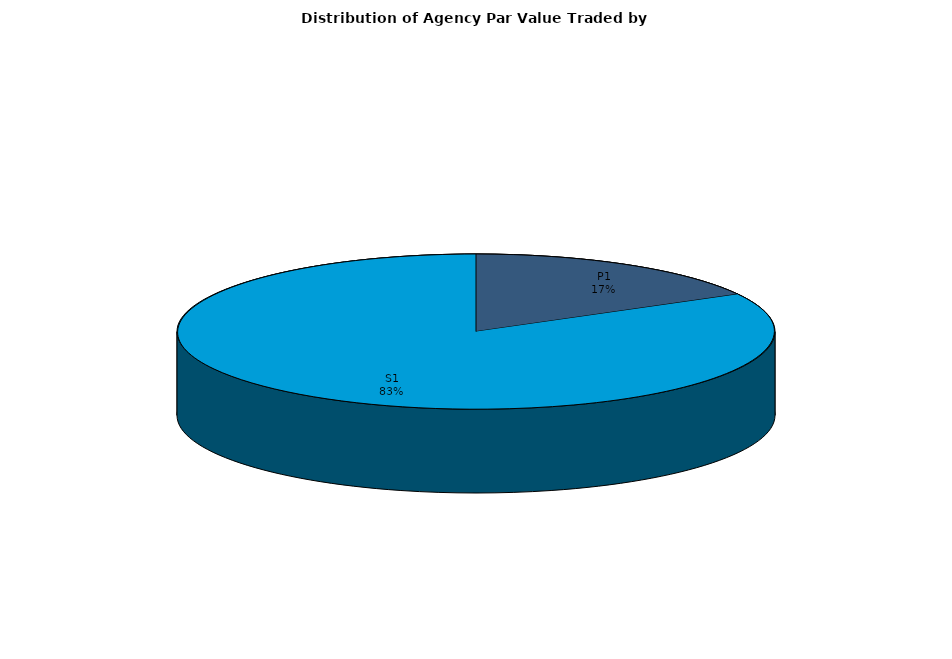
| Category | Series 0 |
|---|---|
| P1 | 851882950.159 |
| S1 | 4163083015.909 |